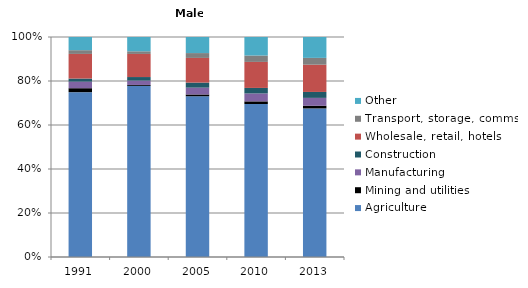
| Category | Agriculture | Mining and utilities | Manufacturing | Construction | Wholesale, retail, hotels | Transport, storage, comms | Other |
|---|---|---|---|---|---|---|---|
| 1991.0 | 75 | 1.8 | 3 | 1.4 | 11.2 | 1.7 | 6 |
| 2000.0 | 77.8 | 0.4 | 2 | 1.6 | 10.5 | 1.2 | 6.5 |
| 2005.0 | 73 | 0.8 | 3.1 | 2.3 | 11.2 | 2.2 | 7.3 |
| 2010.0 | 69.4 | 1.2 | 3.6 | 2.5 | 11.8 | 2.9 | 8.4 |
| 2013.0 | 67.6 | 1.2 | 3.6 | 2.7 | 12.4 | 3.1 | 9.5 |